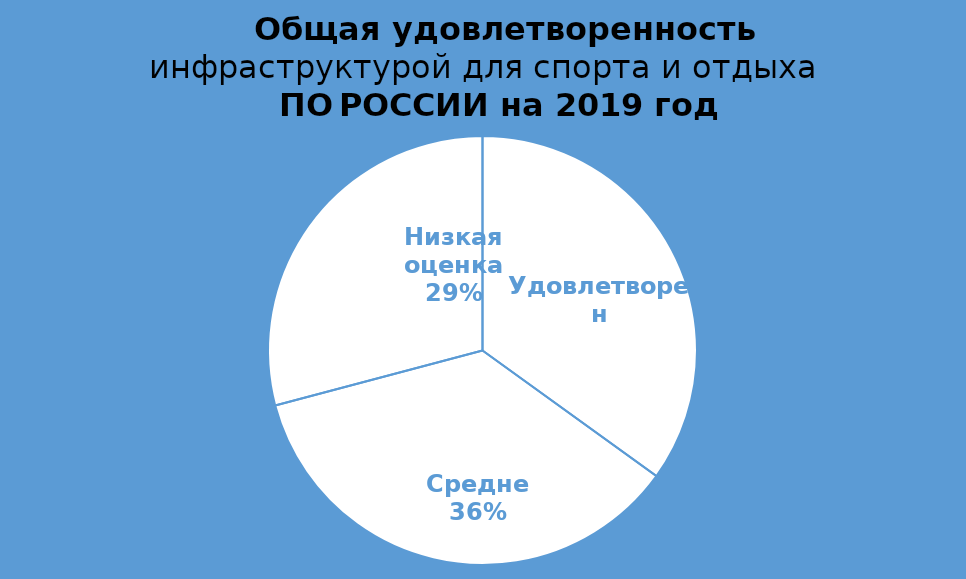
| Category | Процент |
|---|---|
| Удовлетворен | 36 |
| Средне | 37 |
| Низкая оценка | 30 |